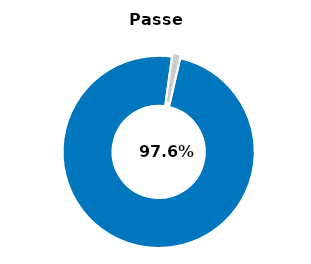
| Category | Series 0 |
|---|---|
| Passed | 0.986 |
| Other | 0.014 |